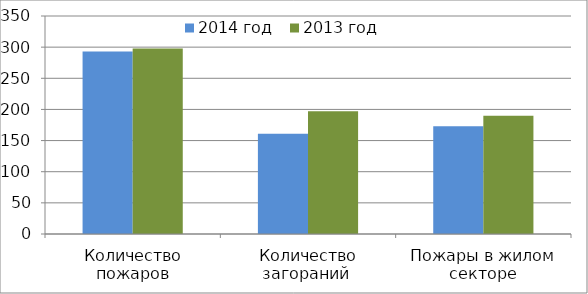
| Category | 2014 год | 2013 год |
|---|---|---|
| Количество пожаров | 293 | 298 |
| Количество загораний  | 161 | 197 |
| Пожары в жилом секторе | 173 | 190 |